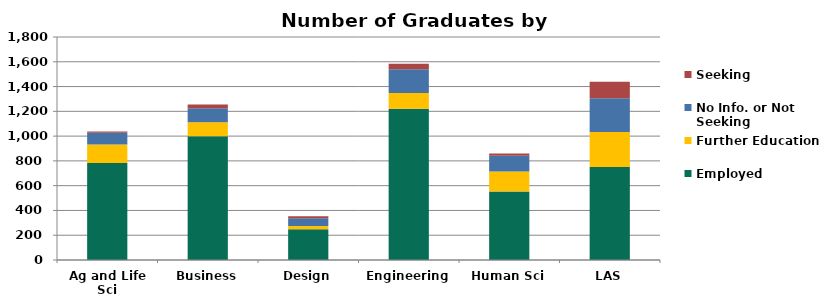
| Category | Employed | Further Education | No Info. or Not Seeking | Seeking |
|---|---|---|---|---|
| Ag and Life Sci | 783 | 149 | 95 | 10 |
| Business | 998 | 113 | 114 | 31 |
| Design | 249 | 26 | 61 | 17 |
| Engineering | 1220 | 127 | 192 | 46 |
| Human Sci | 553 | 162 | 127 | 18 |
| LAS | 750 | 284 | 272 | 133 |